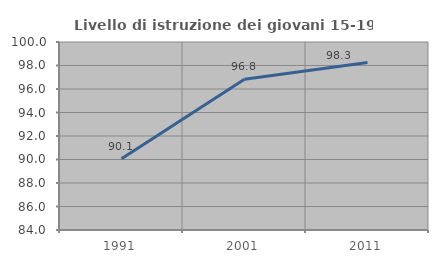
| Category | Livello di istruzione dei giovani 15-19 anni |
|---|---|
| 1991.0 | 90.063 |
| 2001.0 | 96.835 |
| 2011.0 | 98.257 |